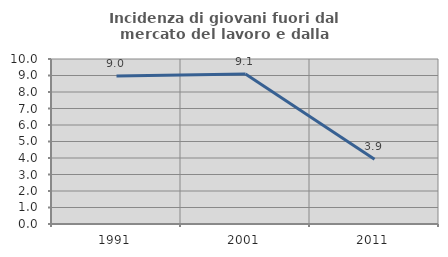
| Category | Incidenza di giovani fuori dal mercato del lavoro e dalla formazione  |
|---|---|
| 1991.0 | 8.974 |
| 2001.0 | 9.091 |
| 2011.0 | 3.922 |